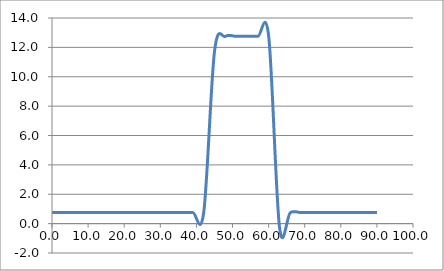
| Category | Elevation (in.) |
|---|---|
| 0.024 | 0.75 |
| 3.024 | 0.75 |
| 6.024 | 0.75 |
| 9.024000000000001 | 0.75 |
| 12.024000000000001 | 0.75 |
| 15.024000000000001 | 0.75 |
| 18.024 | 0.75 |
| 21.024 | 0.75 |
| 24.023999999999997 | 0.75 |
| 27.023999999999997 | 0.75 |
| 30.023999999999997 | 0.75 |
| 33.024 | 0.75 |
| 36.024 | 0.75 |
| 39.024 | 0.75 |
| 42.024 | 0.75 |
| 45.024 | 11.75 |
| 48.024 | 12.75 |
| 51.024 | 12.75 |
| 54.024 | 12.75 |
| 57.024 | 12.75 |
| 60.024 | 12.75 |
| 63.024 | -0.25 |
| 66.024 | 0.75 |
| 69.024 | 0.75 |
| 72.024 | 0.75 |
| 75.024 | 0.75 |
| 78.024 | 0.75 |
| 81.024 | 0.75 |
| 84.024 | 0.75 |
| 87.024 | 0.75 |
| 90.024 | 0.75 |